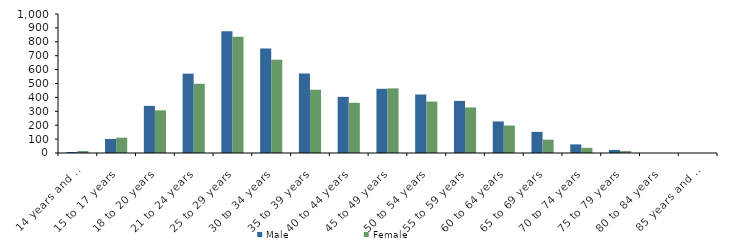
| Category | Male | Female |
|---|---|---|
| 14 years and under | 7 | 14 |
| 15 to 17 years | 101 | 110 |
| 18 to 20 years | 339 | 307 |
| 21 to 24 years | 571 | 498 |
| 25 to 29 years | 876 | 837 |
| 30 to 34 years | 751 | 670 |
| 35 to 39 years | 572 | 455 |
| 40 to 44 years | 404 | 361 |
| 45 to 49 years | 462 | 465 |
| 50 to 54 years | 421 | 370 |
| 55 to 59 years | 375 | 328 |
| 60 to 64 years | 227 | 198 |
| 65 to 69 years | 152 | 96 |
| 70 to 74 years | 62 | 37 |
| 75 to 79 years | 22 | 14 |
| 80 to 84 years | 0 | 0 |
| 85 years and over | 0 | 0 |